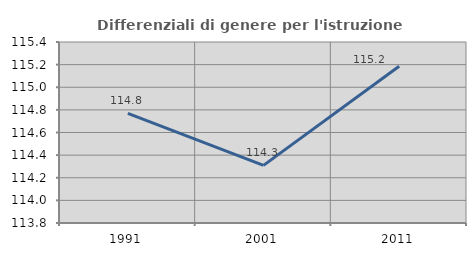
| Category | Differenziali di genere per l'istruzione superiore |
|---|---|
| 1991.0 | 114.77 |
| 2001.0 | 114.309 |
| 2011.0 | 115.186 |